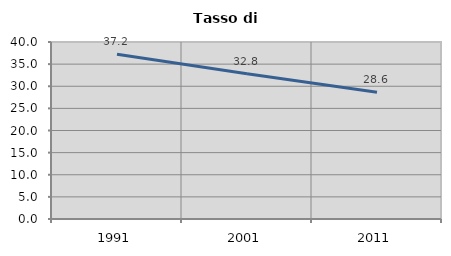
| Category | Tasso di disoccupazione   |
|---|---|
| 1991.0 | 37.226 |
| 2001.0 | 32.837 |
| 2011.0 | 28.649 |